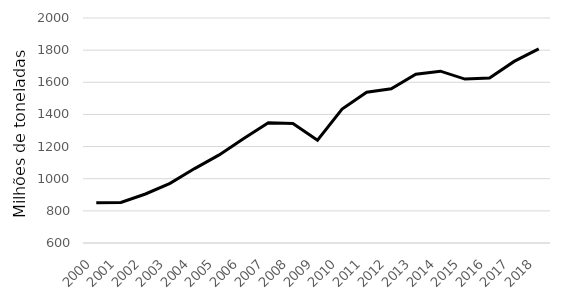
| Category | Series 1 |
|---|---|
| 2000.0 | 850 |
| 2001.0 | 852 |
| 2002.0 | 905 |
| 2003.0 | 971 |
| 2004.0 | 1063 |
| 2005.0 | 1148 |
| 2006.0 | 1250 |
| 2007.0 | 1348 |
| 2008.0 | 1343 |
| 2009.0 | 1239 |
| 2010.0 | 1433 |
| 2011.0 | 1538 |
| 2012.0 | 1560 |
| 2013.0 | 1650 |
| 2014.0 | 1669 |
| 2015.0 | 1620 |
| 2016.0 | 1627 |
| 2017.0 | 1730 |
| 2018.0 | 1808 |